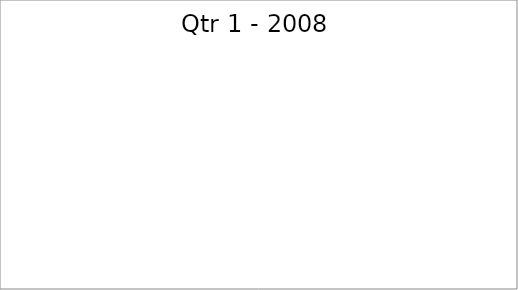
| Category | Series 0 |
|---|---|
| Budget | 3370 |
| Projected | 2570 |
| Actual | 3210 |
| Forecast | 1750 |